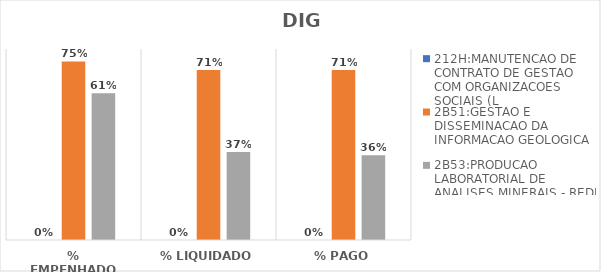
| Category | 212H:MANUTENCAO DE CONTRATO DE GESTAO COM ORGANIZACOES SOCIAIS (L | 2B51:GESTAO E DISSEMINACAO DA INFORMACAO GEOLOGICA | 2B53:PRODUCAO LABORATORIAL DE ANALISES MINERAIS - REDE LAMIN |
|---|---|---|---|
| % EMPENHADO | 0 | 0.748 | 0.615 |
| % LIQUIDADO | 0 | 0.712 | 0.369 |
| % PAGO | 0 | 0.712 | 0.355 |